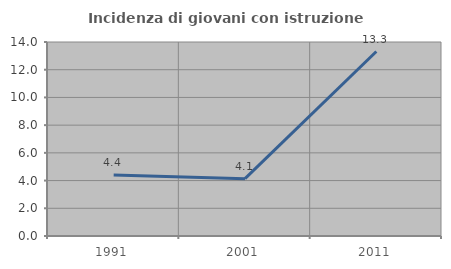
| Category | Incidenza di giovani con istruzione universitaria |
|---|---|
| 1991.0 | 4.396 |
| 2001.0 | 4.14 |
| 2011.0 | 13.312 |